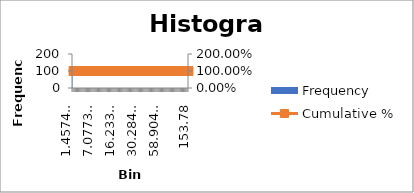
| Category | Frequency |
|---|---|
| 1.45740272 | 104 |
| 1.76712333 | 0 |
| 2.11667189 | 0 |
| 2.48537 | 0 |
| 3.167771 | 0 |
| 3.29592809 | 0 |
| 3.34037352 | 0 |
| 3.640388 | 0 |
| 3.729175 | 0 |
| 4.189559 | 0 |
| 4.55217366 | 0 |
| 4.699729 | 0 |
| 4.882846 | 0 |
| 5.10399374 | 0 |
| 5.25173393 | 0 |
| 5.44266515 | 0 |
| 5.77094355 | 0 |
| 5.85289448 | 0 |
| 6.71872705 | 0 |
| 7.030808 | 0 |
| 7.07734954 | 0 |
| 7.1984 | 0 |
| 9.872172 | 0 |
| 10.25729647 | 0 |
| 10.34383245 | 0 |
| 10.39838804 | 0 |
| 10.469856 | 0 |
| 10.545187 | 0 |
| 10.712316 | 0 |
| 10.72815174 | 0 |
| 11.112717 | 0 |
| 11.654833 | 0 |
| 11.750446 | 0 |
| 12.807232 | 0 |
| 13.680125 | 0 |
| 13.897366 | 0 |
| 14.187999 | 0 |
| 14.555016 | 0 |
| 15.71209 | 0 |
| 15.79335505 | 0 |
| 16.233042 | 0 |
| 16.551247 | 0 |
| 17.04569551 | 0 |
| 17.62 | 0 |
| 18.02067128 | 0 |
| 18.279711 | 0 |
| 18.408 | 0 |
| 18.79 | 0 |
| 19.614048 | 0 |
| 20.492655 | 0 |
| 20.90940535 | 0 |
| 21.82254 | 0 |
| 23.82 | 0 |
| 24.187605 | 0 |
| 24.187605 | 0 |
| 24.3651768 | 0 |
| 27.958 | 0 |
| 27.958 | 0 |
| 28.85 | 0 |
| 29.487005 | 0 |
| 30.284672 | 0 |
| 31.050861 | 0 |
| 32.877258 | 0 |
| 33.361 | 0 |
| 34.26872225 | 0 |
| 34.354126 | 0 |
| 34.986053 | 0 |
| 35.73029074 | 0 |
| 36.618252 | 0 |
| 37.28 | 0 |
| 39.1007731 | 0 |
| 39.92 | 0 |
| 40.3 | 0 |
| 40.698 | 0 |
| 41.68344623 | 0 |
| 45.86 | 0 |
| 46.633232 | 0 |
| 46.633232 | 0 |
| 53.24 | 0 |
| 56.790806 | 0 |
| 58.904678 | 0 |
| 60.307549 | 0 |
| 61.25 | 0 |
| 63.051464 | 0 |
| 66.611 | 0 |
| 77.4 | 0 |
| 79.78 | 0 |
| 80.79 | 0 |
| 81.07239467 | 0 |
| 86.83736449 | 0 |
| 87.05 | 0 |
| 91.28230664 | 0 |
| 92.65 | 0 |
| 95.315979 | 0 |
| 95.315979 | 0 |
| 99.831299 | 0 |
| 104.432961 | 0 |
| 106.5105171 | 0 |
| 138.037018 | 0 |
| 153.42 | 0 |
| 153.78 | 0 |
| 164.694183 | 0 |
| 215.581 | 0 |
| 265.22 | 0 |
| More | 0 |